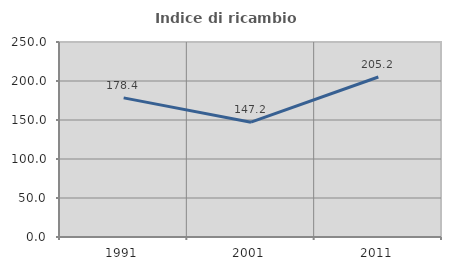
| Category | Indice di ricambio occupazionale  |
|---|---|
| 1991.0 | 178.378 |
| 2001.0 | 147.17 |
| 2011.0 | 205.155 |